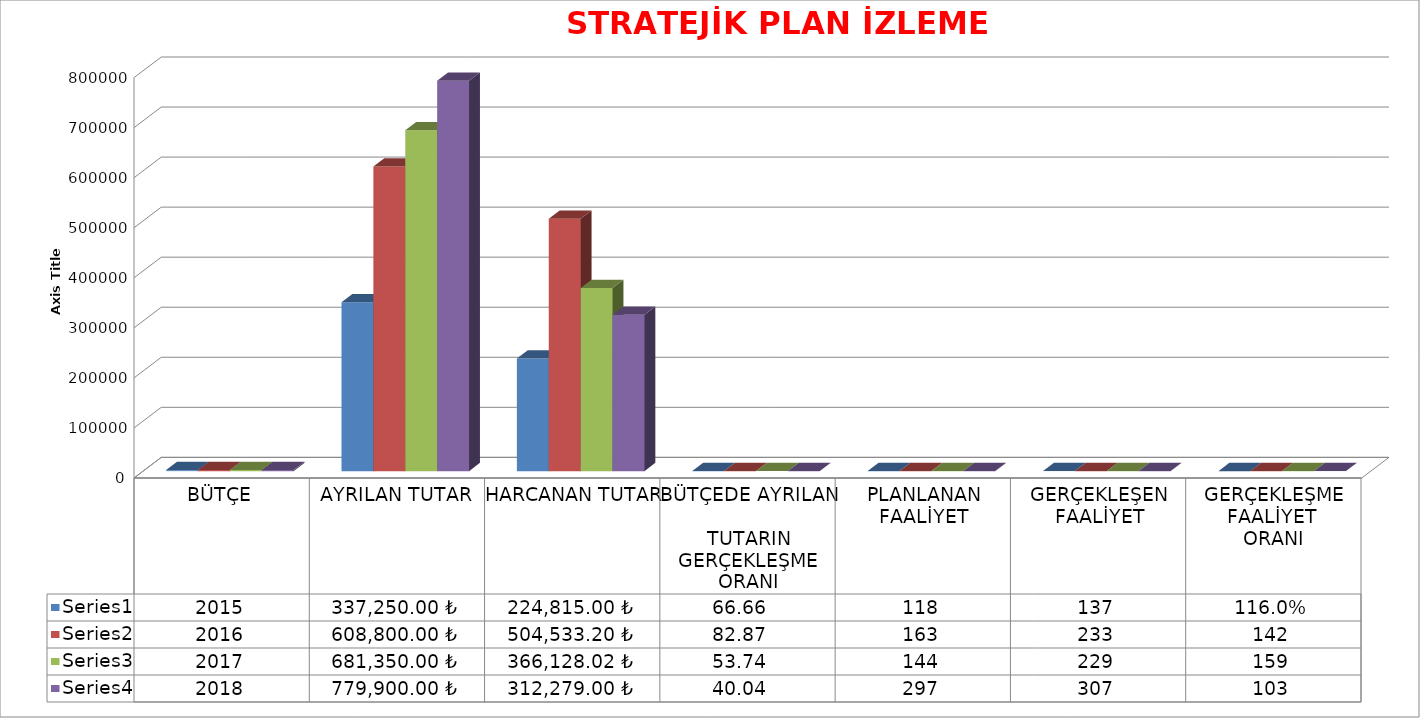
| Category | Series 0 | Series 1 | Series 2 | Series 3 |
|---|---|---|---|---|
| BÜTÇE | 2015 | 2016 | 2017 | 2018 |
| AYRILAN TUTAR | 337250 | 608800 | 681350 | 779900 |
| HARCANAN TUTAR | 224815 | 504533.2 | 366128.02 | 312279 |
| BÜTÇEDE AYRILAN 
TUTARIN GERÇEKLEŞME ORANI | 66.661 | 82.873 | 53.736 | 40.041 |
| PLANLANAN FAALİYET | 118 | 163 | 144 | 297 |
| GERÇEKLEŞEN FAALİYET | 137 | 233 | 229 | 307 |
| GERÇEKLEŞME FAALİYET 
ORANI | 1.16 | 142 | 159 | 103 |